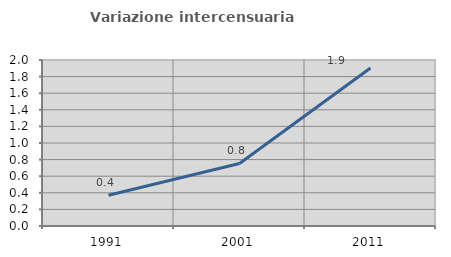
| Category | Variazione intercensuaria annua |
|---|---|
| 1991.0 | 0.37 |
| 2001.0 | 0.753 |
| 2011.0 | 1.904 |